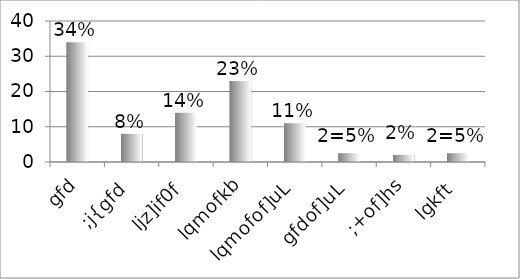
| Category | Series 0 |
|---|---|
| gfd | 34 |
| ;j{gfd | 8 |
| ljz]if0f | 14 |
| lqmofkb | 23 |
| lqmofof]uL | 11 |
| gfdof]uL | 2.5 |
| ;+of]hs | 2 |
| lgkft | 2.5 |